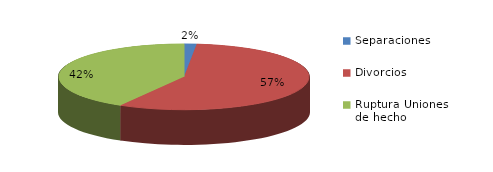
| Category | Series 0 |
|---|---|
| Separaciones | 33 |
| Divorcios | 1174 |
| Ruptura Uniones de hecho | 860 |